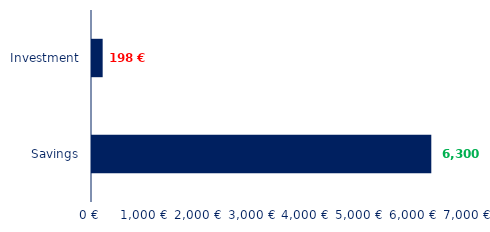
| Category | Series 0 |
|---|---|
| 0 | 6300 |
| 1 | 198 |